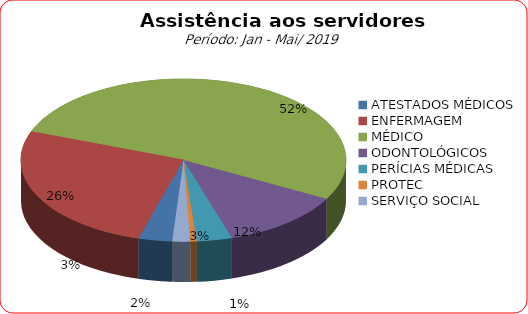
| Category | Series 0 |
|---|---|
| ATESTADOS MÉDICOS | 3.337 |
| ENFERMAGEM | 26.247 |
| MÉDICO | 52.231 |
| ODONTOLÓGICOS | 12.298 |
| PERÍCIAS MÉDICAS | 3.487 |
| PROTEC | 0.637 |
| SERVIÇO SOCIAL | 1.762 |